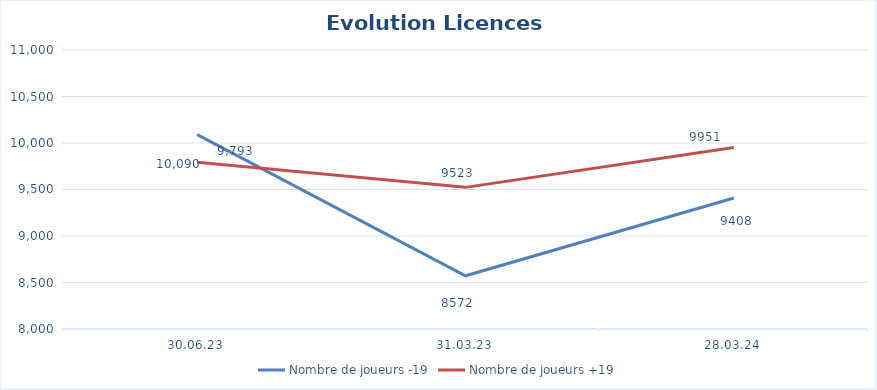
| Category | Nombre de joueurs -19 | Nombre de joueurs +19 |
|---|---|---|
| 30.06.23 | 10090 | 9793 |
| 31.03.23 | 8572 | 9523 |
| 28.03.24 | 9408 | 9951 |